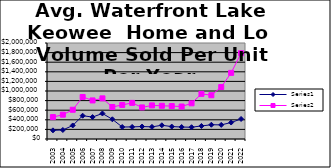
| Category | Series 0 | Series 1 |
|---|---|---|
| 2003.0 | 180188 | 456225 |
| 2004.0 | 187619 | 507014 |
| 2005.0 | 282153 | 609199 |
| 2006.0 | 485305 | 875482 |
| 2007.0 | 456742 | 803432 |
| 2008.0 | 532091 | 846541 |
| 2009.0 | 410777 | 667624 |
| 2010.0 | 249982 | 709658 |
| 2011.0 | 251757 | 752512 |
| 2012.0 | 259674 | 657878 |
| 2013.0 | 252883 | 700164 |
| 2014.0 | 286107 | 692125 |
| 2015.0 | 258976 | 686138 |
| 2016.0 | 249095 | 676553 |
| 2017.0 | 245481 | 743287 |
| 2018.0 | 271575 | 940258 |
| 2019.0 | 296997 | 911787 |
| 2020.0 | 294011 | 1082773 |
| 2021.0 | 343229 | 1377717 |
| 2022.0 | 417146 | 1787501 |